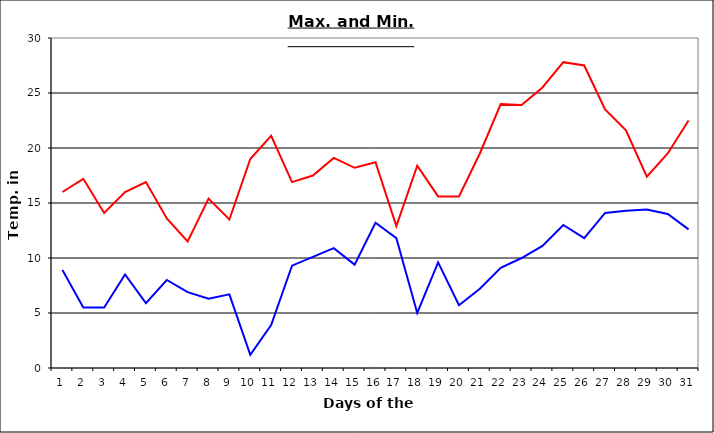
| Category | Series 0 | Series 1 |
|---|---|---|
| 0 | 16 | 8.9 |
| 1 | 17.2 | 5.5 |
| 2 | 14.1 | 5.5 |
| 3 | 16 | 8.5 |
| 4 | 16.9 | 5.9 |
| 5 | 13.6 | 8 |
| 6 | 11.5 | 6.9 |
| 7 | 15.4 | 6.3 |
| 8 | 13.5 | 6.7 |
| 9 | 19 | 1.2 |
| 10 | 21.1 | 3.9 |
| 11 | 16.9 | 9.3 |
| 12 | 17.5 | 10.1 |
| 13 | 19.1 | 10.9 |
| 14 | 18.2 | 9.4 |
| 15 | 18.7 | 13.2 |
| 16 | 12.9 | 11.8 |
| 17 | 18.4 | 5 |
| 18 | 15.6 | 9.6 |
| 19 | 15.6 | 5.7 |
| 20 | 19.5 | 7.2 |
| 21 | 24 | 9.1 |
| 22 | 23.9 | 10 |
| 23 | 25.5 | 11.1 |
| 24 | 27.8 | 13 |
| 25 | 27.5 | 11.8 |
| 26 | 23.5 | 14.1 |
| 27 | 21.6 | 14.3 |
| 28 | 17.4 | 14.4 |
| 29 | 19.5 | 14 |
| 30 | 22.5 | 12.6 |